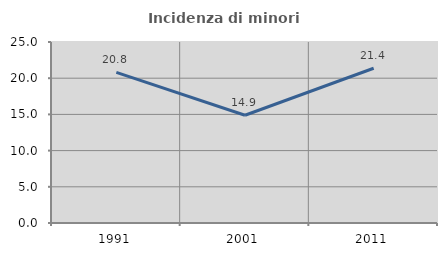
| Category | Incidenza di minori stranieri |
|---|---|
| 1991.0 | 20.8 |
| 2001.0 | 14.885 |
| 2011.0 | 21.372 |